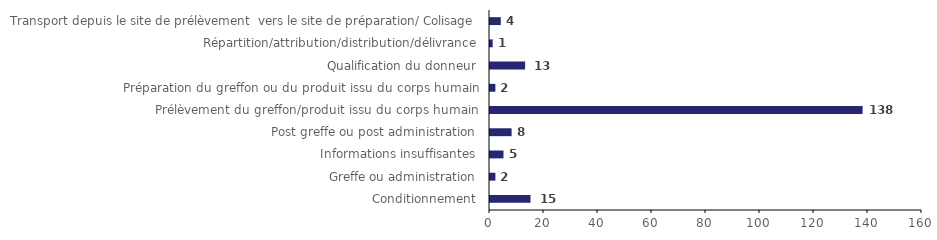
| Category | Series 0 |
|---|---|
| Conditionnement | 15 |
| Greffe ou administration | 2 |
| Informations insuffisantes | 5 |
| Post greffe ou post administration | 8 |
| Prélèvement du greffon/produit issu du corps humain | 138 |
| Préparation du greffon ou du produit issu du corps humain | 2 |
| Qualification du donneur | 13 |
| Répartition/attribution/distribution/délivrance | 1 |
| Transport depuis le site de prélèvement  vers le site de préparation/ Colisage | 4 |